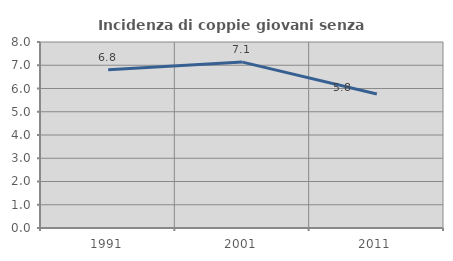
| Category | Incidenza di coppie giovani senza figli |
|---|---|
| 1991.0 | 6.803 |
| 2001.0 | 7.136 |
| 2011.0 | 5.76 |